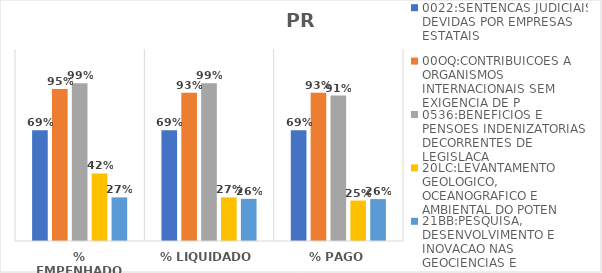
| Category | 0022:SENTENCAS JUDICIAIS DEVIDAS POR EMPRESAS ESTATAIS | 00OQ:CONTRIBUICOES A ORGANISMOS INTERNACIONAIS SEM EXIGENCIA DE P | 0536:BENEFICIOS E PENSOES INDENIZATORIAS DECORRENTES DE LEGISLACA | 20LC:LEVANTAMENTO GEOLOGICO, OCEANOGRAFICO E AMBIENTAL DO POTEN | 21BB:PESQUISA, DESENVOLVIMENTO E INOVACAO NAS GEOCIENCIAS E |
|---|---|---|---|---|---|
| % EMPENHADO | 0.693 | 0.95 | 0.985 | 0.423 | 0.273 |
| % LIQUIDADO | 0.693 | 0.926 | 0.985 | 0.272 | 0.263 |
| % PAGO | 0.693 | 0.926 | 0.909 | 0.253 | 0.262 |